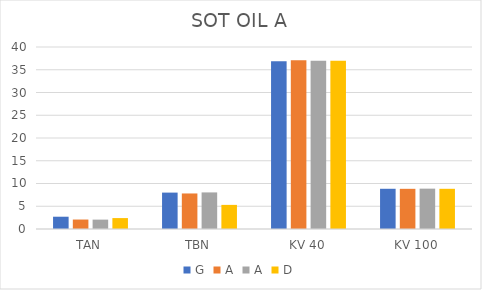
| Category | G | A | D |
|---|---|---|---|
| TAN | 2.7 | 2.06 | 2.4 |
| TBN | 8 | 8.04 | 5.3 |
| KV 40 | 36.88 | 36.99 | 36.98 |
| KV 100 | 8.84 | 8.87 | 8.834 |